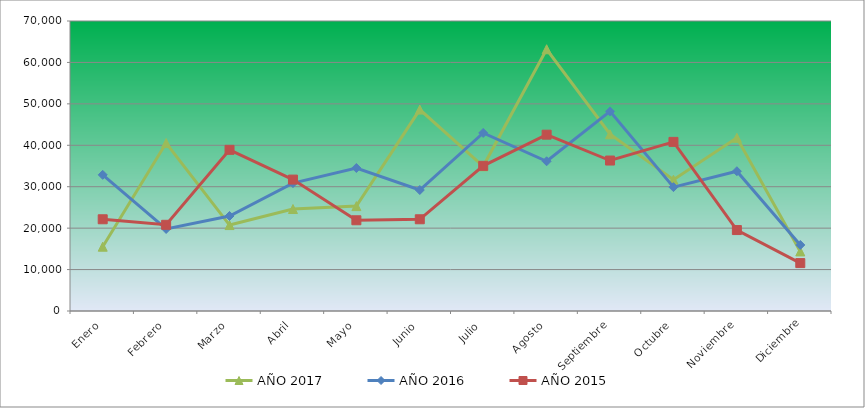
| Category | AÑO 2017 | AÑO 2016 | AÑO 2015 |
|---|---|---|---|
| Enero | 15520 | 32870 | 22140 |
| Febrero | 40540 | 19800 | 20805 |
| Marzo | 20740 | 22940 | 38900 |
| Abril | 24620 | 30860 | 31720 |
| Mayo | 25320 | 34520 | 21900 |
| Junio | 48620 | 29200 | 22140 |
| Julio | 34930 | 42980 | 35040 |
| Agosto | 63180 | 36140 | 42560 |
| Septiembre | 42660 | 48180 | 36320 |
| Octubre | 31700 | 29900 | 40820 |
| Noviembre | 41800 | 33740 | 19540 |
| Diciembre | 14380 | 15940 | 11560 |